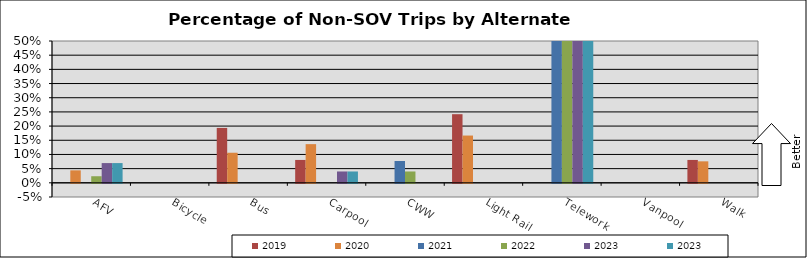
| Category | 2019 | 2020 | 2021 | 2022 | 2023 |
|---|---|---|---|---|---|
| AFV | 0 | 0.044 | 0 | 0.023 | 0.07 |
| Bicycle | 0 | 0 | 0 | 0 | 0 |
| Bus | 0.194 | 0.106 | 0 | 0 | 0 |
| Carpool | 0.081 | 0.136 | 0 | 0 | 0.04 |
| CWW | 0 | 0 | 0.077 | 0.04 | 0 |
| Light Rail | 0.242 | 0.167 | 0 | 0 | 0 |
| Telework | 0 | 0 | 0.885 | 0.9 | 0.84 |
| Vanpool | 0 | 0 | 0 | 0 | 0 |
| Walk | 0.081 | 0.076 | 0 | 0 | 0 |